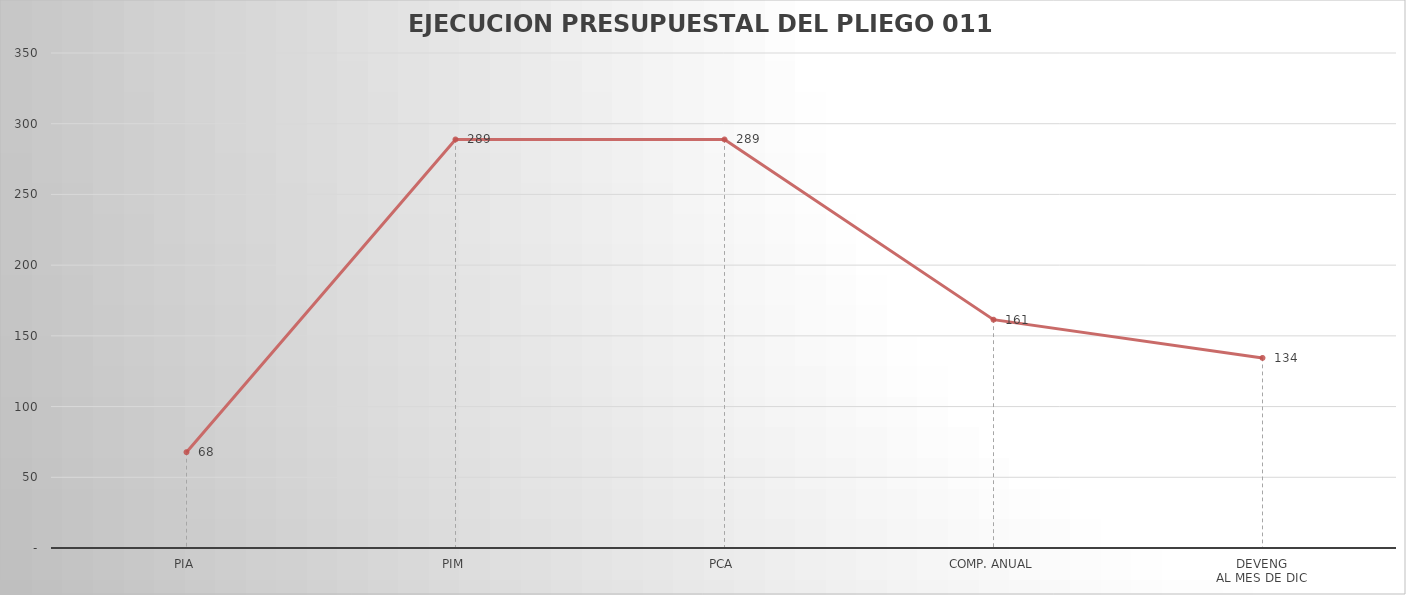
| Category | Series 0 |
|---|---|
| PIA | 67.768 |
| PIM | 288.87 |
| PCA | 288.87 |
| COMP. ANUAL | 161.447 |
| DEVENG
AL MES DE DIC | 134.401 |